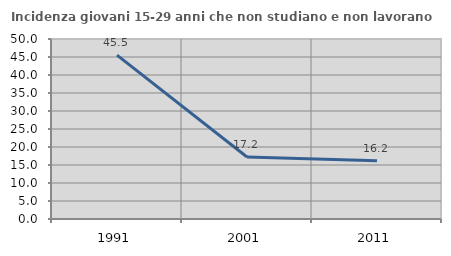
| Category | Incidenza giovani 15-29 anni che non studiano e non lavorano  |
|---|---|
| 1991.0 | 45.515 |
| 2001.0 | 17.219 |
| 2011.0 | 16.186 |